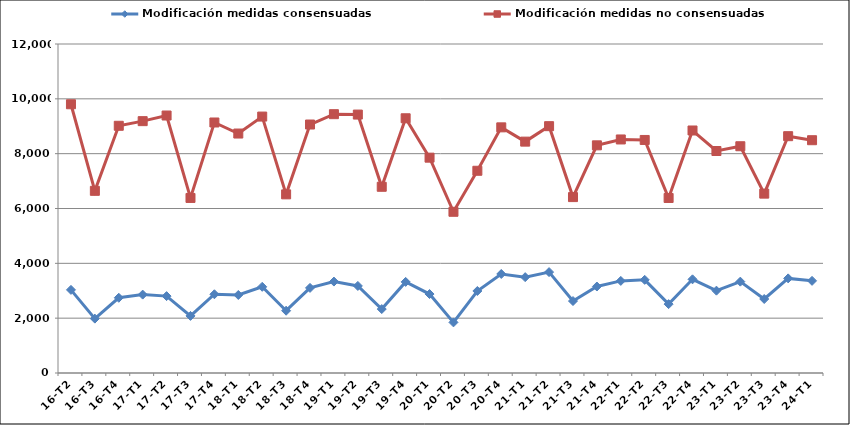
| Category | Modificación medidas consensuadas | Modificación medidas no consensuadas |
|---|---|---|
| 16-T2 | 3032 | 9802 |
| 16-T3 | 1983 | 6644 |
| 16-T4 | 2744 | 9017 |
| 17-T1 | 2859 | 9186 |
| 17-T2 | 2804 | 9391 |
| 17-T3 | 2082 | 6385 |
| 17-T4 | 2872 | 9137 |
| 18-T1 | 2846 | 8734 |
| 18-T2 | 3144 | 9353 |
| 18-T3 | 2272 | 6516 |
| 18-T4 | 3104 | 9063 |
| 19-T1 | 3335 | 9440 |
| 19-T2 | 3176 | 9426 |
| 19-T3 | 2332 | 6792 |
| 19-T4 | 3323 | 9291 |
| 20-T1 | 2880 | 7854 |
| 20-T2 | 1846 | 5880 |
| 20-T3 | 2991 | 7376 |
| 20-T4 | 3612 | 8960 |
| 21-T1 | 3496 | 8439 |
| 21-T2 | 3680 | 9003 |
| 21-T3 | 2625 | 6416 |
| 21-T4 | 3154 | 8304 |
| 22-T1 | 3359 | 8518 |
| 22-T2 | 3398 | 8500 |
| 22-T3 | 2512 | 6384 |
| 22-T4 | 3417 | 8845 |
| 23-T1 | 3003 | 8097 |
| 23-T2 | 3332 | 8271 |
| 23-T3 | 2699 | 6542 |
| 23-T4 | 3451 | 8638 |
| 24-T1 | 3361 | 8491 |